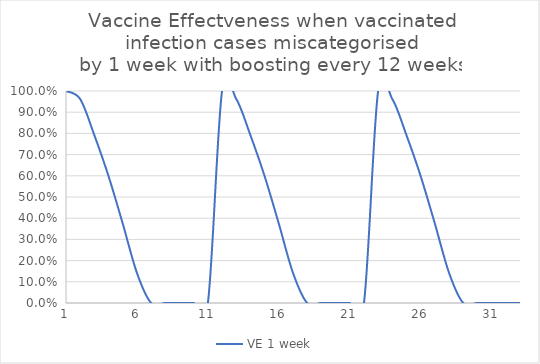
| Category | VE 1 week |
|---|---|
| 0 | 1 |
| 1 | 0.962 |
| 2 | 0.791 |
| 3 | 0.598 |
| 4 | 0.374 |
| 5 | 0.142 |
| 6 | 0 |
| 7 | 0 |
| 8 | 0 |
| 9 | 0 |
| 10 | 0 |
| 11 | 1 |
| 12 | 0.962 |
| 13 | 0.791 |
| 14 | 0.598 |
| 15 | 0.374 |
| 16 | 0.142 |
| 17 | 0 |
| 18 | 0 |
| 19 | 0 |
| 20 | 0 |
| 21 | 0 |
| 22 | 1 |
| 23 | 0.962 |
| 24 | 0.791 |
| 25 | 0.598 |
| 26 | 0.374 |
| 27 | 0.142 |
| 28 | 0 |
| 29 | 0 |
| 30 | 0 |
| 31 | 0 |
| 32 | 0 |